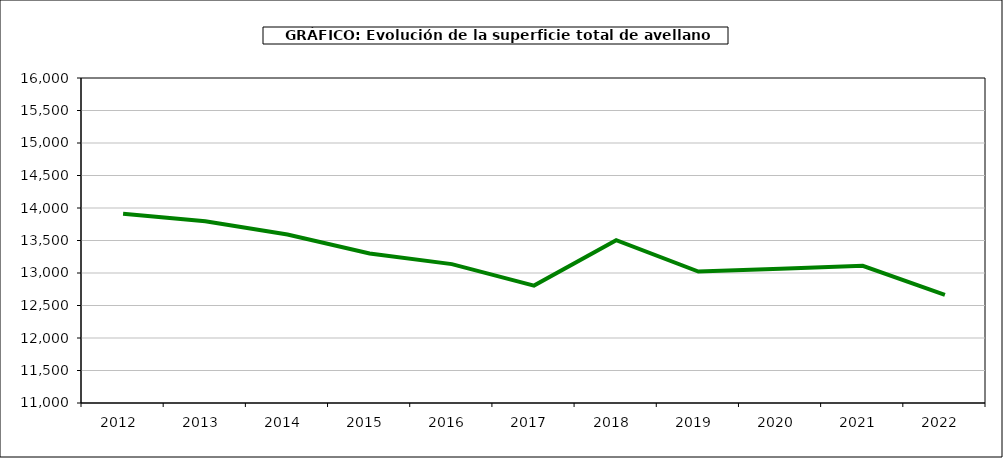
| Category | superficie avellano |
|---|---|
| 2012.0 | 13912 |
| 2013.0 | 13796 |
| 2014.0 | 13591 |
| 2015.0 | 13301 |
| 2016.0 | 13137 |
| 2017.0 | 12806 |
| 2018.0 | 13505 |
| 2019.0 | 13023 |
| 2020.0 | 13067 |
| 2021.0 | 13110 |
| 2022.0 | 12663 |